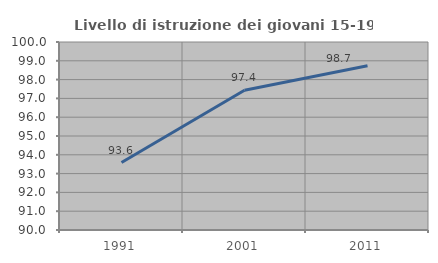
| Category | Livello di istruzione dei giovani 15-19 anni |
|---|---|
| 1991.0 | 93.59 |
| 2001.0 | 97.436 |
| 2011.0 | 98.734 |